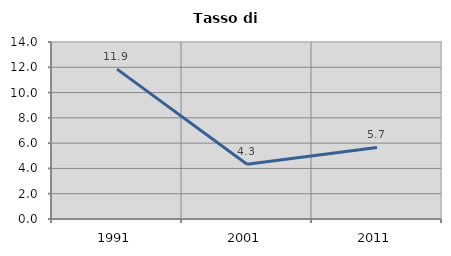
| Category | Tasso di disoccupazione   |
|---|---|
| 1991.0 | 11.854 |
| 2001.0 | 4.336 |
| 2011.0 | 5.659 |